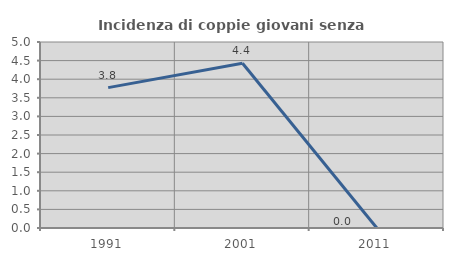
| Category | Incidenza di coppie giovani senza figli |
|---|---|
| 1991.0 | 3.774 |
| 2001.0 | 4.43 |
| 2011.0 | 0 |